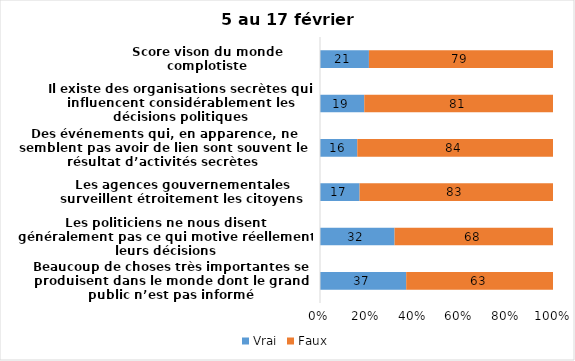
| Category | Vrai | Faux |
|---|---|---|
| Beaucoup de choses très importantes se produisent dans le monde dont le grand public n’est pas informé | 37 | 63 |
| Les politiciens ne nous disent généralement pas ce qui motive réellement leurs décisions | 32 | 68 |
| Les agences gouvernementales surveillent étroitement les citoyens | 17 | 83 |
| Des événements qui, en apparence, ne semblent pas avoir de lien sont souvent le résultat d’activités secrètes | 16 | 84 |
| Il existe des organisations secrètes qui influencent considérablement les décisions politiques | 19 | 81 |
| Score vison du monde complotiste | 21 | 79 |